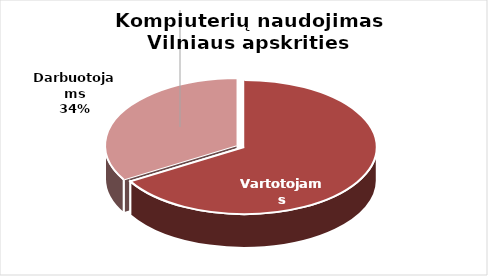
| Category | Series 0 |
|---|---|
| Vartotojams | 804 |
| Darbuotojams | 406 |